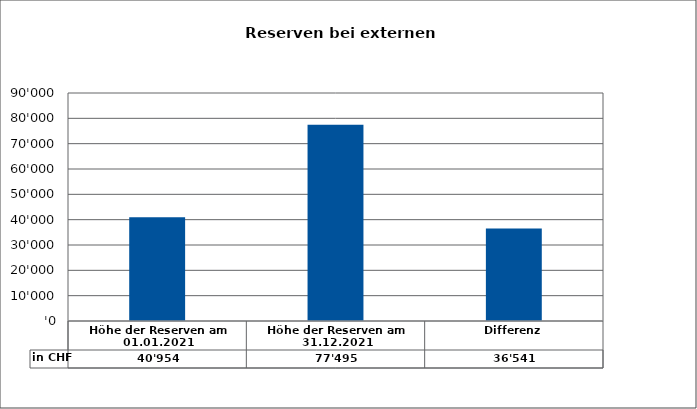
| Category | in CHF |
|---|---|
| Höhe der Reserven am 01.01.2021 | 40953.86 |
| Höhe der Reserven am 31.12.2021 | 77495 |
| Differenz | 36541.14 |